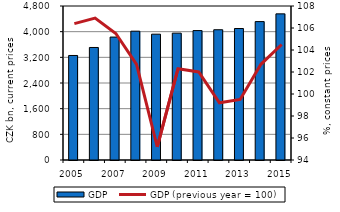
| Category | GDP |
|---|---|
| 2005.0 | 3258 |
| 2006.0 | 3507.1 |
| 2007.0 | 3831.8 |
| 2008.0 | 4015.3 |
| 2009.0 | 3921.8 |
| 2010.0 | 3953.7 |
| 2011.0 | 4033.8 |
| 2012.0 | 4059.9 |
| 2013.0 | 4098.1 |
| 2014.0 | 4313.8 |
| 2015.0 | 4554.6 |